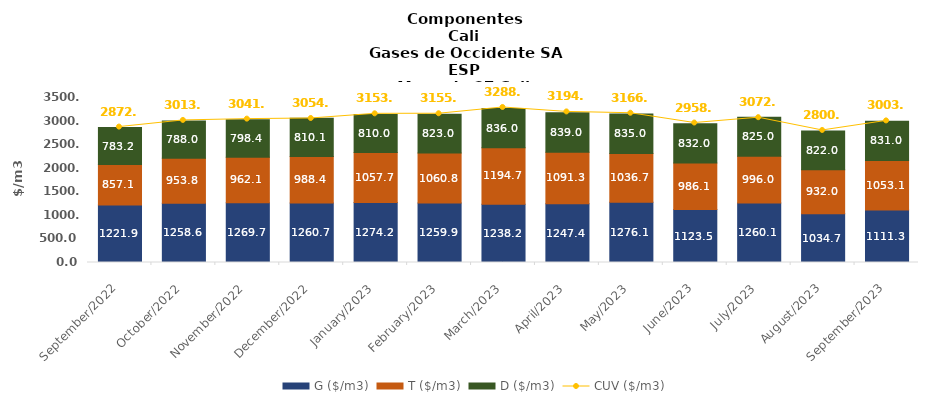
| Category | G ($/m3) | T ($/m3) | D ($/m3) |
|---|---|---|---|
| 2022-09-01 | 1221.85 | 857.06 | 783.19 |
| 2022-10-01 | 1258.64 | 953.77 | 787.98 |
| 2022-11-01 | 1269.65 | 962.1 | 798.39 |
| 2022-12-01 | 1260.7 | 988.43 | 810.07 |
| 2023-01-01 | 1274.19 | 1057.73 | 810 |
| 2023-02-01 | 1259.91 | 1060.8 | 823 |
| 2023-03-01 | 1238.18 | 1194.68 | 836 |
| 2023-04-01 | 1247.38 | 1091.29 | 839 |
| 2023-05-01 | 1276.06 | 1036.67 | 835 |
| 2023-06-01 | 1123.54 | 986.08 | 832 |
| 2023-07-01 | 1260.12 | 995.95 | 825 |
| 2023-08-01 | 1034.65 | 931.99 | 822 |
| 2023-09-01 | 1111.32 | 1053.08 | 831 |